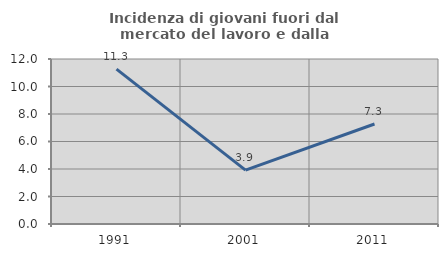
| Category | Incidenza di giovani fuori dal mercato del lavoro e dalla formazione  |
|---|---|
| 1991.0 | 11.268 |
| 2001.0 | 3.922 |
| 2011.0 | 7.273 |